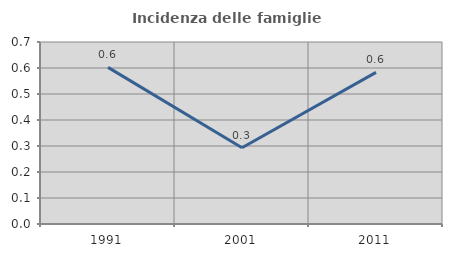
| Category | Incidenza delle famiglie numerose |
|---|---|
| 1991.0 | 0.602 |
| 2001.0 | 0.293 |
| 2011.0 | 0.583 |